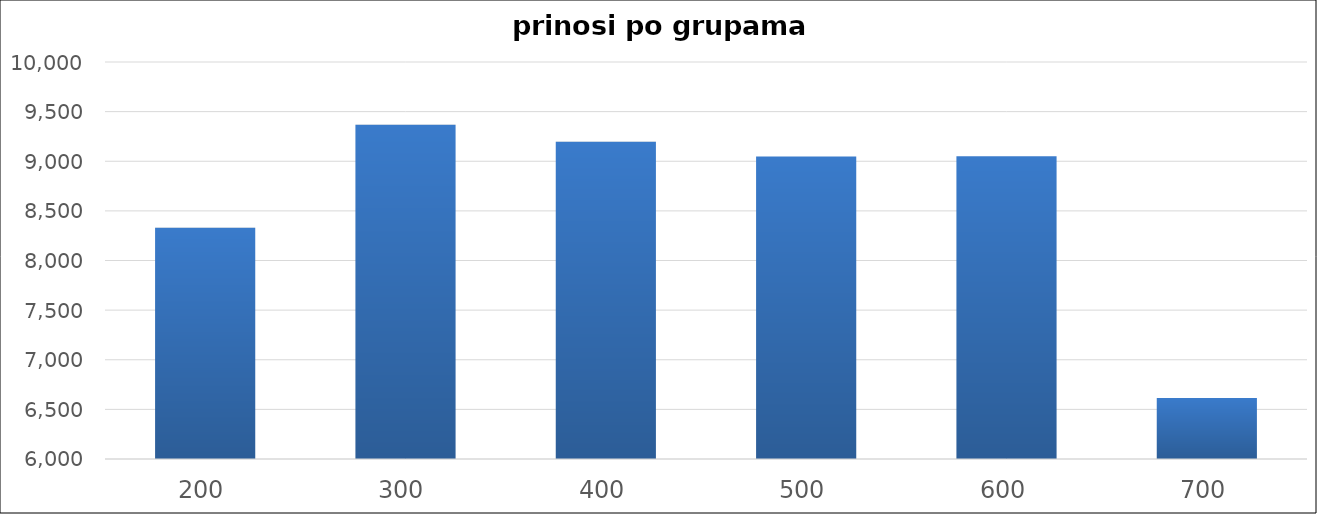
| Category | Series 0 |
|---|---|
| 200 | 8331 |
| 300 | 9367 |
| 400 | 9197 |
| 500 | 9048 |
| 600 | 9051 |
| 700 | 6614 |